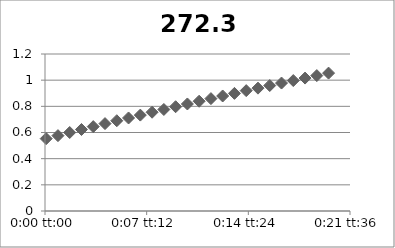
| Category | 272.3 |
|---|---|
| 5.78703703703704e-05 | 0.553 |
| 0.000636574074074074 | 0.576 |
| 0.00121527777777778 | 0.6 |
| 0.00179398148148148 | 0.623 |
| 0.00237268518518518 | 0.645 |
| 0.00295138888888889 | 0.668 |
| 0.00353009259259259 | 0.69 |
| 0.0041087962962963 | 0.711 |
| 0.0046875 | 0.733 |
| 0.0052662037037037 | 0.755 |
| 0.00584490740740741 | 0.776 |
| 0.00642361111111111 | 0.797 |
| 0.00700231481481481 | 0.818 |
| 0.00758101851851852 | 0.839 |
| 0.00815972222222222 | 0.859 |
| 0.00873842592592592 | 0.879 |
| 0.00931712962962963 | 0.899 |
| 0.00989583333333333 | 0.92 |
| 0.010474537037037 | 0.939 |
| 0.0110532407407407 | 0.959 |
| 0.0116319444444444 | 0.978 |
| 0.0122106481481481 | 0.997 |
| 0.0127893518518518 | 1.016 |
| 0.0133680555555556 | 1.035 |
| 0.0139467592592593 | 1.054 |